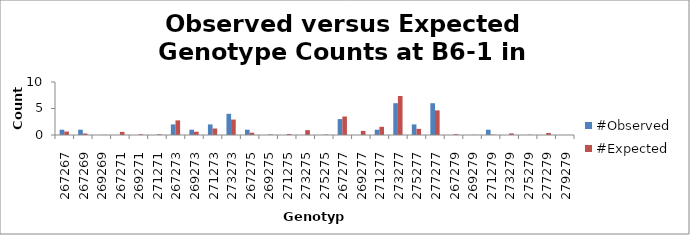
| Category | #Observed | #Expected |
|---|---|---|
| 267267.0 | 1 | 0.653 |
| 267269.0 | 1 | 0.29 |
| 269269.0 | 0 | 0.032 |
| 267271.0 | 0 | 0.581 |
| 269271.0 | 0 | 0.129 |
| 271271.0 | 0 | 0.129 |
| 267273.0 | 2 | 2.758 |
| 269273.0 | 1 | 0.613 |
| 271273.0 | 2 | 1.226 |
| 273273.0 | 4 | 2.911 |
| 267275.0 | 1 | 0.435 |
| 269275.0 | 0 | 0.097 |
| 271275.0 | 0 | 0.194 |
| 273275.0 | 0 | 0.919 |
| 275275.0 | 0 | 0.073 |
| 267277.0 | 3 | 3.484 |
| 269277.0 | 0 | 0.774 |
| 271277.0 | 1 | 1.548 |
| 273277.0 | 6 | 7.355 |
| 275277.0 | 2 | 1.161 |
| 277277.0 | 6 | 4.645 |
| 267279.0 | 0 | 0.145 |
| 269279.0 | 0 | 0.032 |
| 271279.0 | 1 | 0.065 |
| 273279.0 | 0 | 0.306 |
| 275279.0 | 0 | 0.048 |
| 277279.0 | 0 | 0.387 |
| 279279.0 | 0 | 0.008 |